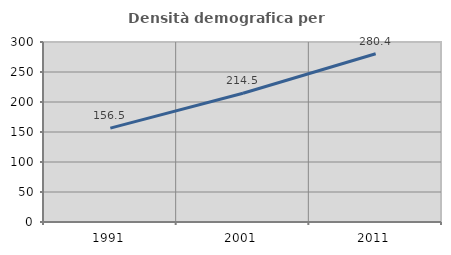
| Category | Densità demografica |
|---|---|
| 1991.0 | 156.524 |
| 2001.0 | 214.544 |
| 2011.0 | 280.432 |